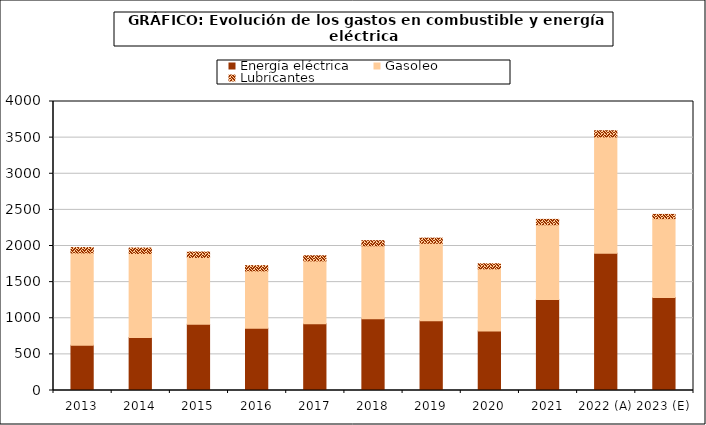
| Category | Energía eléctrica | Gasoleo | Lubricantes |
|---|---|---|---|
| 2013 | 628.022 | 1275.795 | 74.642 |
| 2014 | 733.314 | 1163.411 | 75.37 |
| 2015 | 915.498 | 926.353 | 75.218 |
| 2016 | 861.816 | 793.633 | 72.641 |
| 2017 | 922.733 | 871.301 | 70.822 |
| 2018 | 993.507 | 1009.663 | 70.844 |
| 2019 | 965.958 | 1071.529 | 71.16 |
| 2020 | 824.258 | 859.494 | 70.661 |
| 2021 | 1258.465 | 1035.825 | 74.097 |
| 2022 (A) | 1901.35 | 1607.894 | 86.079 |
| 2023 (E) | 1288.903 | 1089.973 | 58.352 |